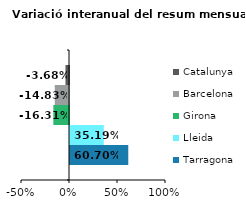
| Category | Tarragona | Lleida | Girona | Barcelona | Catalunya |
|---|---|---|---|---|---|
| 0 | 0.607 | 0.352 | -0.163 | -0.148 | -0.037 |